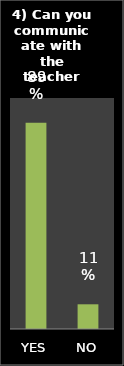
| Category | Series 0 |
|---|---|
| YES | 0.893 |
| NO | 0.107 |